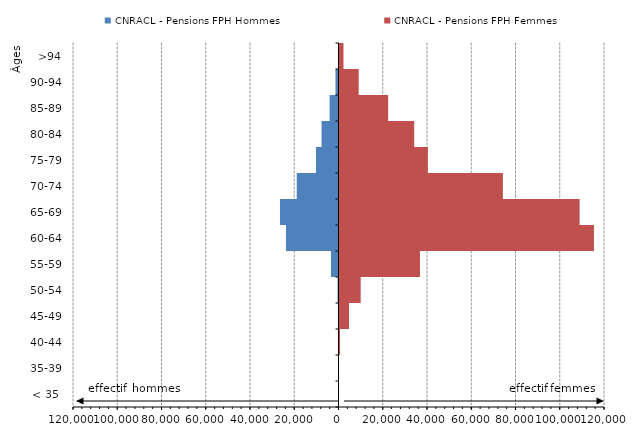
| Category | CNRACL - Pensions FPH Hommes | CNRACL - Pensions FPH Femmes |
|---|---|---|
| < 35  | -3 | 21 |
| 35-39 | -22 | 140 |
| 40-44 | -73 | 710 |
| 45-49 | -210 | 4772 |
| 50-54 | -426 | 10031 |
| 55-59 | -3403 | 36819 |
| 60-64 | -23736 | 115468 |
| 65-69 | -26451 | 108976 |
| 70-74 | -18882 | 74303 |
| 75-79 | -10188 | 40413 |
| 80-84 | -7658 | 34219 |
| 85-89 | -4024 | 22441 |
| 90-94 | -1365 | 9134 |
| >94 | -253 | 2252 |